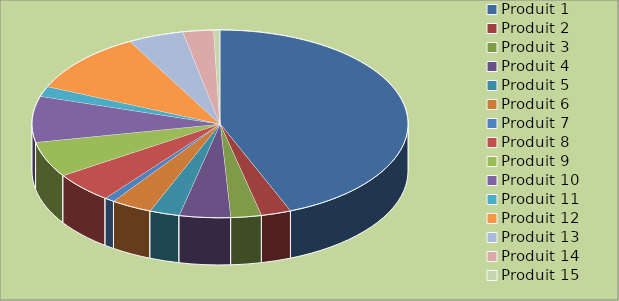
| Category | Series 0 |
|---|---|
| Produit 1 | 5000 |
| Produit 2 | 294 |
| Produit 3 | 300 |
| Produit 4 | 500 |
| Produit 5 | 294 |
| Produit 6 | 400 |
| Produit 7 | 100 |
| Produit 8 | 600 |
| Produit 9 | 700 |
| Produit 10 | 900 |
| Produit 11 | 200 |
| Produit 12 | 1200 |
| Produit 13 | 544 |
| Produit 14 | 300 |
| Produit 15 | 60 |